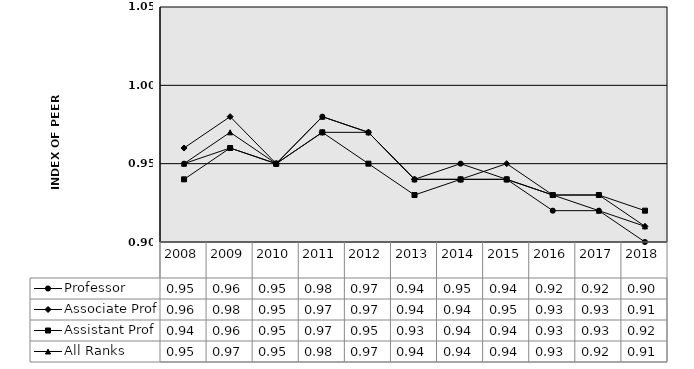
| Category | Professor | Associate Prof | Assistant Prof | All Ranks |
|---|---|---|---|---|
| 2008.0 | 0.95 | 0.96 | 0.94 | 0.95 |
| 2009.0 | 0.96 | 0.98 | 0.96 | 0.97 |
| 2010.0 | 0.95 | 0.95 | 0.95 | 0.95 |
| 2011.0 | 0.98 | 0.97 | 0.97 | 0.98 |
| 2012.0 | 0.97 | 0.97 | 0.95 | 0.97 |
| 2013.0 | 0.94 | 0.94 | 0.93 | 0.94 |
| 2014.0 | 0.95 | 0.94 | 0.94 | 0.94 |
| 2015.0 | 0.94 | 0.95 | 0.94 | 0.94 |
| 2016.0 | 0.92 | 0.93 | 0.93 | 0.93 |
| 2017.0 | 0.92 | 0.93 | 0.93 | 0.92 |
| 2018.0 | 0.9 | 0.91 | 0.92 | 0.91 |